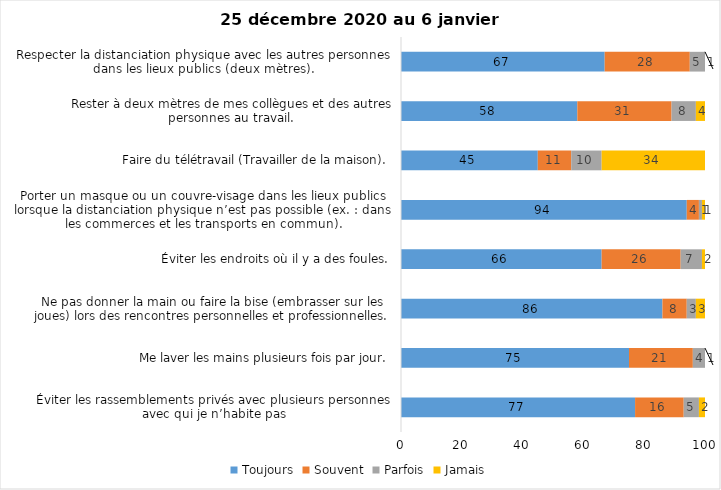
| Category | Toujours | Souvent | Parfois | Jamais |
|---|---|---|---|---|
| Éviter les rassemblements privés avec plusieurs personnes avec qui je n’habite pas | 77 | 16 | 5 | 2 |
| Me laver les mains plusieurs fois par jour. | 75 | 21 | 4 | 1 |
| Ne pas donner la main ou faire la bise (embrasser sur les joues) lors des rencontres personnelles et professionnelles. | 86 | 8 | 3 | 3 |
| Éviter les endroits où il y a des foules. | 66 | 26 | 7 | 2 |
| Porter un masque ou un couvre-visage dans les lieux publics lorsque la distanciation physique n’est pas possible (ex. : dans les commerces et les transports en commun). | 94 | 4 | 1 | 1 |
| Faire du télétravail (Travailler de la maison). | 45 | 11 | 10 | 34 |
| Rester à deux mètres de mes collègues et des autres personnes au travail. | 58 | 31 | 8 | 4 |
| Respecter la distanciation physique avec les autres personnes dans les lieux publics (deux mètres). | 67 | 28 | 5 | 1 |